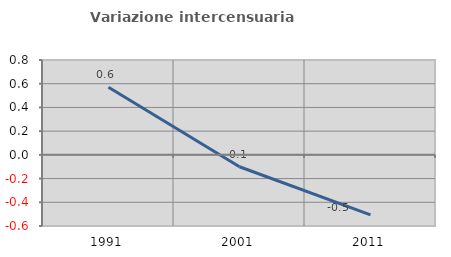
| Category | Variazione intercensuaria annua |
|---|---|
| 1991.0 | 0.57 |
| 2001.0 | -0.1 |
| 2011.0 | -0.506 |